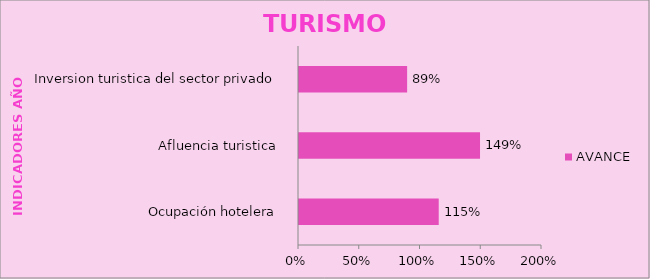
| Category | AVANCE |
|---|---|
| Ocupación hotelera  | 1.15 |
| Afluencia turistica  | 1.49 |
| Inversion turistica del sector privado  | 0.89 |